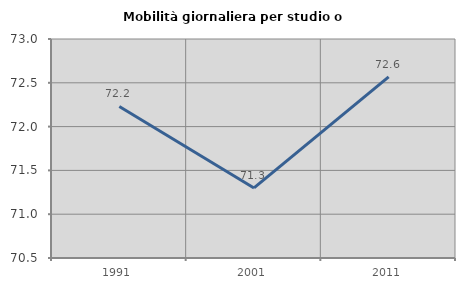
| Category | Mobilità giornaliera per studio o lavoro |
|---|---|
| 1991.0 | 72.23 |
| 2001.0 | 71.3 |
| 2011.0 | 72.567 |